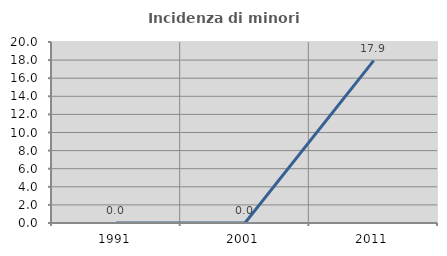
| Category | Incidenza di minori stranieri |
|---|---|
| 1991.0 | 0 |
| 2001.0 | 0 |
| 2011.0 | 17.949 |